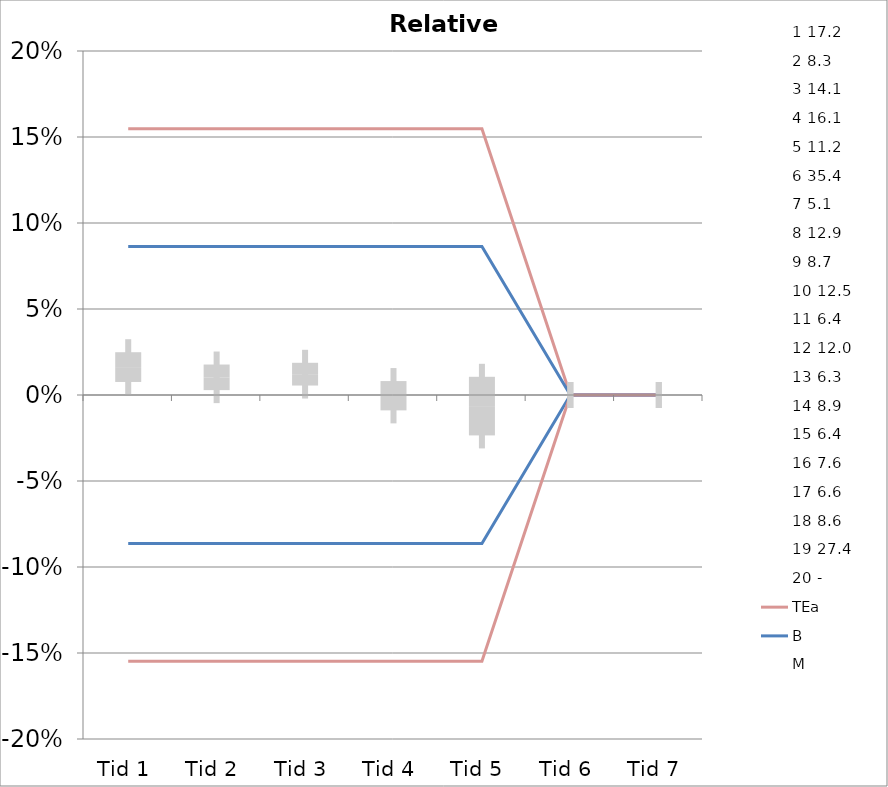
| Category | 1 | 2 | 3 | 4 | 5 | 6 | 7 | 8 | 9 | 10 | 11 | 12 | 13 | 14 | 15 | 16 | 17 | 18 | 19 | 20 | TEa | B | -B | -TEa | M |
|---|---|---|---|---|---|---|---|---|---|---|---|---|---|---|---|---|---|---|---|---|---|---|---|---|---|
| Tid 1 | 0.027 | 0.031 | 0.037 | 0.027 | 0.012 | 0.012 | 0.026 | 0.019 | 0.001 | 0.009 | 0.053 | 0.017 | 0.027 | 0.022 | 0.019 | 0.004 | -0.025 | -0.015 | 0.006 | 0 | 0.155 | 0.086 | -0.086 | -0.155 | 0.016 |
| Tid 2 | 0.003 | 0.016 | 0.025 | 0.02 | 0.008 | 0.035 | 0.032 | 0 | 0.001 | -0.023 | 0.015 | 0.011 | 0.005 | 0.024 | 0.025 | 0.015 | -0.02 | 0.005 | -0.001 | 0 | 0.155 | 0.086 | -0.086 | -0.155 | 0.01 |
| Tid 3 | 0.015 | 0.01 | 0.026 | 0.025 | 0.006 | 0.033 | 0.008 | 0.005 | -0.005 | -0.011 | 0.009 | 0.013 | 0.022 | 0.01 | 0.036 | 0.019 | -0.011 | 0 | 0.009 | 0 | 0.155 | 0.086 | -0.086 | -0.155 | 0.012 |
| Tid 4 | 0.033 | 0.026 | 0.009 | 0.013 | 0.003 | 0.008 | 0.005 | -0.014 | -0.019 | -0.019 | 0.008 | -0.015 | -0.002 | 0.008 | -0.001 | -0.002 | -0.039 | 0 | -0.007 | 0 | 0.155 | 0.086 | -0.086 | -0.155 | 0 |
| Tid 5 | -0.025 | -0.058 | -0.012 | -0.064 | -0.002 | 0.002 | 0.046 | 0.032 | -0.067 | -0.01 | 0.05 | 0.004 | 0 | -0.003 | 0.03 | 0.017 | -0.006 | -0.06 | 0.005 | 0 | 0.155 | 0.086 | -0.086 | -0.155 | -0.006 |
| Tid 6 | 0 | 0 | 0 | 0 | 0 | 0 | 0 | 0 | 0 | 0 | 0 | 0 | 0 | 0 | 0 | 0 | 0 | 0 | 0 | 0 | 0 | 0 | 0 | 0 | 0 |
| Tid 7 | 0 | 0 | 0 | 0 | 0 | 0 | 0 | 0 | 0 | 0 | 0 | 0 | 0 | 0 | 0 | 0 | 0 | 0 | 0 | 0 | 0 | 0 | 0 | 0 | 0 |